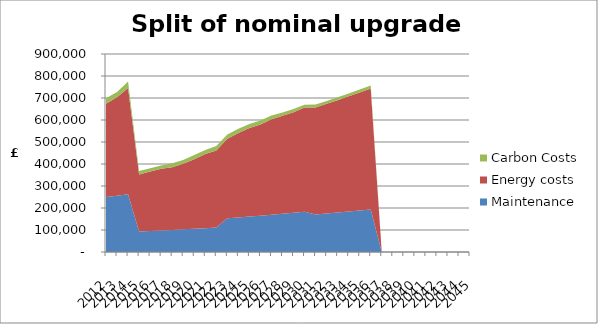
| Category | Maintenance | Energy costs | Carbon Costs |
|---|---|---|---|
| 2012.0 | 249882.068 | 423898.789 | 24621.928 |
| 2013.0 | 256129.12 | 447472.975 | 24098.057 |
| 2014.0 | 262532.348 | 482656.619 | 30035.259 |
| 2015.0 | 93232.86 | 258832.958 | 15773.896 |
| 2016.0 | 95563.681 | 270186.667 | 15040.226 |
| 2017.0 | 97952.773 | 280038.981 | 14673.391 |
| 2018.0 | 100401.593 | 285349.891 | 17883.196 |
| 2019.0 | 102918.595 | 298553.936 | 16966.109 |
| 2020.0 | 105491.56 | 316519.739 | 18914.918 |
| 2021.0 | 108128.849 | 337445.898 | 17768.56 |
| 2022.0 | 110832.07 | 350826.835 | 20634.456 |
| 2023.0 | 153442.521 | 361709.98 | 18571.011 |
| 2024.0 | 157278.584 | 384057.516 | 18571.011 |
| 2025.0 | 161210.548 | 402466.973 | 18571.011 |
| 2026.0 | 165240.812 | 414872.595 | 17195.38 |
| 2027.0 | 169383.291 | 434233.572 | 16507.565 |
| 2028.0 | 173617.873 | 445387.024 | 15131.935 |
| 2029.0 | 177958.32 | 457344.943 | 14444.12 |
| 2030.0 | 182407.278 | 474085.921 | 13068.489 |
| 2031.0 | 170946.553 | 485970.945 | 13068.489 |
| 2032.0 | 175220.217 | 498120.218 | 13068.489 |
| 2033.0 | 179600.722 | 510573.224 | 13068.489 |
| 2034.0 | 184090.74 | 523337.554 | 13068.489 |
| 2035.0 | 188705.775 | 536457.284 | 13068.489 |
| 2036.0 | 193423.419 | 549868.716 | 13068.489 |
| 2037.0 | 0 | 0 | 0 |
| 2038.0 | 0 | 0 | 0 |
| 2039.0 | 0 | 0 | 0 |
| 2040.0 | 0 | 0 | 0 |
| 2041.0 | 0 | 0 | 0 |
| 2042.0 | 0 | 0 | 0 |
| 2043.0 | 0 | 0 | 0 |
| 2044.0 | 0 | 0 | 0 |
| 2045.0 | 0 | 0 | 0 |